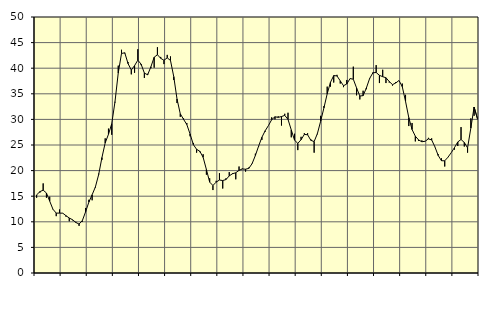
| Category | Piggar | Series 1 |
|---|---|---|
| nan | 14.7 | 15.26 |
| 87.0 | 15.7 | 15.89 |
| 87.0 | 17.5 | 16.18 |
| 87.0 | 14.7 | 15.63 |
| nan | 14.9 | 14.04 |
| 88.0 | 12.4 | 12.45 |
| 88.0 | 11.1 | 11.7 |
| 88.0 | 12.4 | 11.7 |
| nan | 11.7 | 11.68 |
| 89.0 | 11 | 11.19 |
| 89.0 | 10.1 | 10.74 |
| 89.0 | 10.3 | 10.4 |
| nan | 10 | 9.87 |
| 90.0 | 9.2 | 9.56 |
| 90.0 | 10 | 10.23 |
| 90.0 | 12.7 | 11.95 |
| nan | 14.3 | 13.85 |
| 91.0 | 14.2 | 15.28 |
| 91.0 | 16.7 | 16.81 |
| 91.0 | 19.4 | 19.22 |
| nan | 22.1 | 22.54 |
| 92.0 | 26.3 | 25.41 |
| 92.0 | 28.2 | 27.08 |
| 92.0 | 27 | 29.15 |
| nan | 33.3 | 33.45 |
| 93.0 | 40.5 | 39.08 |
| 93.0 | 43.6 | 42.88 |
| 93.0 | 42.9 | 43.01 |
| nan | 41.2 | 40.9 |
| 94.0 | 38.8 | 39.64 |
| 94.0 | 39.1 | 40.51 |
| 94.0 | 43.7 | 41.57 |
| nan | 40.6 | 40.79 |
| 95.0 | 38.1 | 39.05 |
| 95.0 | 38.9 | 38.7 |
| 95.0 | 40 | 40.28 |
| nan | 40.1 | 42.14 |
| 96.0 | 44.1 | 42.63 |
| 96.0 | 42.2 | 41.93 |
| 96.0 | 40.8 | 41.55 |
| nan | 42.6 | 42.02 |
| 97.0 | 42.3 | 41.51 |
| 97.0 | 37.7 | 38.35 |
| 97.0 | 33.2 | 33.99 |
| nan | 30.5 | 31.1 |
| 98.0 | 30.2 | 30.02 |
| 98.0 | 29.3 | 29 |
| 98.0 | 26.7 | 27.15 |
| nan | 25.4 | 25.08 |
| 99.0 | 23.5 | 24.16 |
| 99.0 | 23.6 | 23.77 |
| 99.0 | 23.2 | 22.59 |
| nan | 19.2 | 20.22 |
| 0.0 | 18.5 | 17.75 |
| 0.0 | 16.2 | 17.09 |
| 0.0 | 18 | 17.75 |
| nan | 19.5 | 18.16 |
| 1.0 | 16.5 | 18.06 |
| 1.0 | 18.5 | 18.25 |
| 1.0 | 19.7 | 18.97 |
| nan | 19.5 | 19.39 |
| 2.0 | 18.3 | 19.58 |
| 2.0 | 20.8 | 20.05 |
| 2.0 | 20.4 | 20.32 |
| nan | 19.8 | 20.27 |
| 3.0 | 20.6 | 20.44 |
| 3.0 | 21.3 | 21.36 |
| 3.0 | 23.3 | 22.95 |
| nan | 24.7 | 24.79 |
| 4.0 | 26 | 26.51 |
| 4.0 | 27.6 | 27.78 |
| 4.0 | 28.8 | 28.79 |
| nan | 30.4 | 29.95 |
| 5.0 | 30 | 30.51 |
| 5.0 | 30.6 | 30.4 |
| 5.0 | 28.8 | 30.56 |
| nan | 31.1 | 30.78 |
| 6.0 | 31.3 | 30 |
| 6.0 | 26.5 | 27.95 |
| 6.0 | 27.2 | 25.94 |
| nan | 24 | 25.32 |
| 7.0 | 26.6 | 26.03 |
| 7.0 | 27.3 | 27.07 |
| 7.0 | 27.3 | 27 |
| nan | 26.1 | 25.91 |
| 8.0 | 23.5 | 25.67 |
| 8.0 | 27.1 | 27.23 |
| 8.0 | 30.7 | 29.65 |
| nan | 32.6 | 32.25 |
| 9.0 | 36.4 | 35 |
| 9.0 | 36.4 | 37.24 |
| 9.0 | 37.2 | 38.56 |
| nan | 38.7 | 38.49 |
| 10.0 | 37 | 37.52 |
| 10.0 | 36.3 | 36.58 |
| 10.0 | 37.7 | 36.91 |
| nan | 38 | 37.97 |
| 11.0 | 40.3 | 37.85 |
| 11.0 | 34.7 | 36.15 |
| 11.0 | 33.9 | 34.57 |
| nan | 35.6 | 34.64 |
| 12.0 | 35.9 | 36.13 |
| 12.0 | 37.9 | 37.99 |
| 12.0 | 39.2 | 39.1 |
| nan | 40.6 | 39.16 |
| 13.0 | 37.1 | 38.61 |
| 13.0 | 39.7 | 38.34 |
| 13.0 | 37.1 | 38.14 |
| nan | 37.2 | 37.4 |
| 14.0 | 36.6 | 36.79 |
| 14.0 | 37.3 | 37.11 |
| 14.0 | 37.6 | 37.6 |
| nan | 37 | 36.39 |
| 15.0 | 34.8 | 33.52 |
| 15.0 | 28.7 | 30.34 |
| 15.0 | 29.3 | 28.02 |
| nan | 25.7 | 26.72 |
| 16.0 | 25.8 | 25.99 |
| 16.0 | 25.9 | 25.63 |
| 16.0 | 25.7 | 25.73 |
| nan | 26.4 | 26.19 |
| 17.0 | 26.3 | 26 |
| 17.0 | 24.6 | 24.63 |
| 17.0 | 23.2 | 22.95 |
| nan | 22.4 | 21.93 |
| 18.0 | 20.8 | 21.91 |
| 18.0 | 22.6 | 22.62 |
| 18.0 | 23.5 | 23.51 |
| nan | 24.1 | 24.5 |
| 19.0 | 24.8 | 25.6 |
| 19.0 | 28.5 | 26.08 |
| 19.0 | 24.7 | 25.49 |
| nan | 23.5 | 24.44 |
| 20.0 | 30.2 | 28.3 |
| 20.0 | 30.7 | 32.42 |
| 20.0 | 30 | 30.21 |